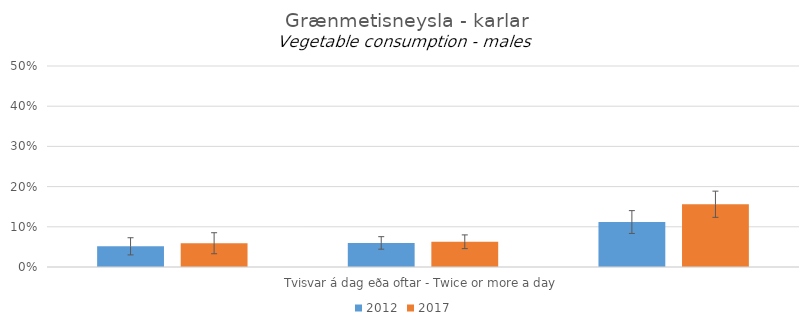
| Category | 2012 | 2017 |
|---|---|---|
| 0 | 0.051 | 0.059 |
| 1 | 0.06 | 0.063 |
| 2 | 0.112 | 0.156 |